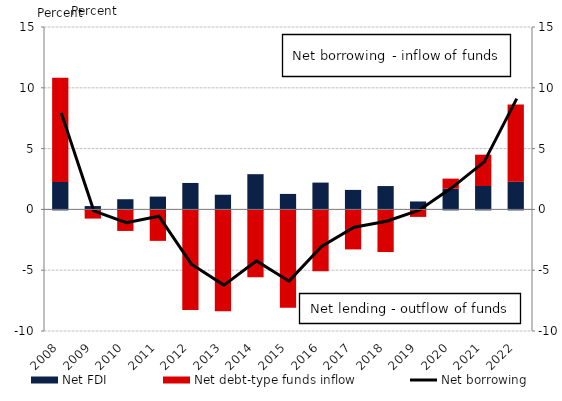
| Category | Net FDI | Net debt-type funds inflow |
|---|---|---|
| 2008.0 | 2.256 | 8.562 |
| 2009.0 | 0.274 | -0.756 |
| 2010.0 | 0.837 | -1.772 |
| 2011.0 | 1.053 | -2.588 |
| 2012.0 | 2.175 | -8.282 |
| 2013.0 | 1.206 | -8.378 |
| 2014.0 | 2.897 | -5.584 |
| 2015.0 | 1.275 | -8.078 |
| 2016.0 | 2.205 | -5.09 |
| 2017.0 | 1.604 | -3.291 |
| 2018.0 | 1.919 | -3.507 |
| 2019.0 | 0.652 | -0.616 |
| 2020.0 | 1.705 | 0.827 |
| 2021.0 | 1.924 | 2.574 |
| 2022.0 | 2.283 | 6.338 |